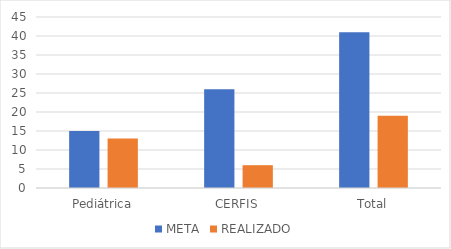
| Category | META | REALIZADO |
|---|---|---|
| Pediátrica | 15 | 13 |
| CERFIS | 26 | 6 |
| Total | 41 | 19 |